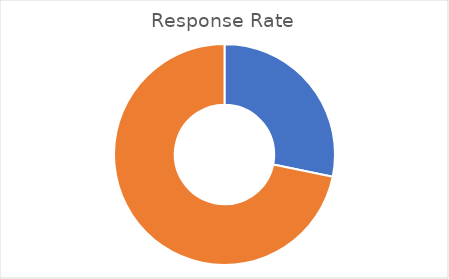
| Category | Total |
|---|---|
| Sum of OverallRespRate | 28.24 |
| Sum of OverallNonRespRate | 71.76 |